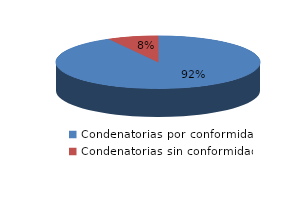
| Category | Series 0 |
|---|---|
| 0 | 254 |
| 1 | 22 |